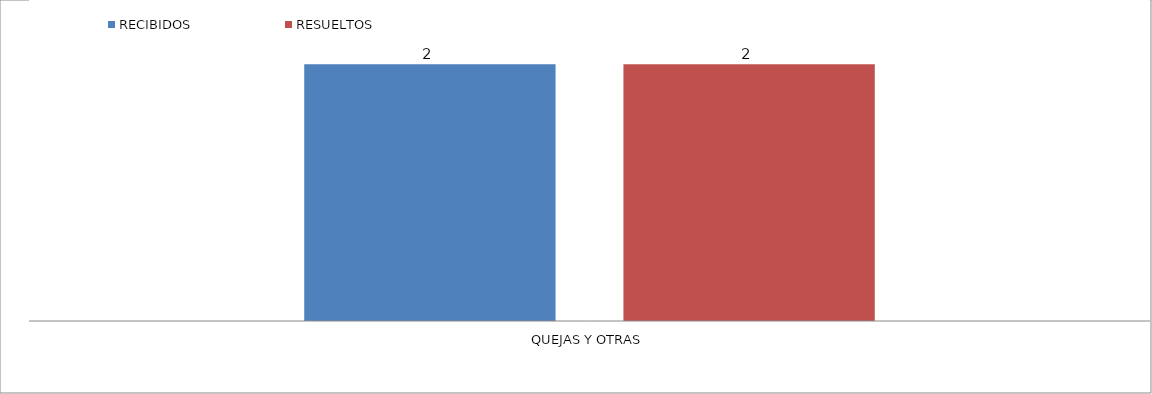
| Category | RECIBIDOS | RESUELTOS  |
|---|---|---|
| QUEJAS Y OTRAS | 2 | 2 |